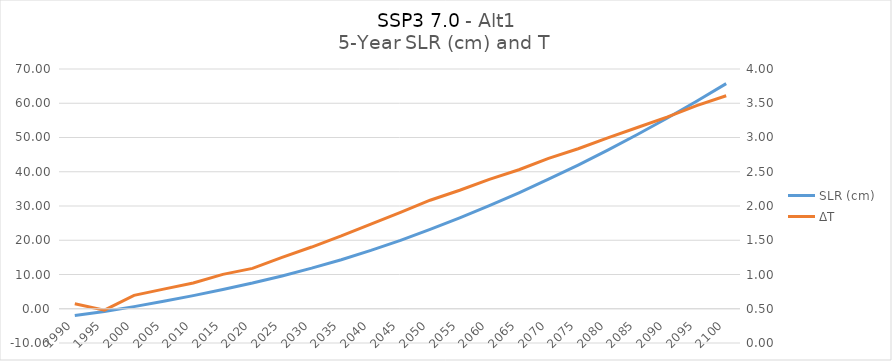
| Category | SLR (cm) |
|---|---|
| 1990.0 | -1.941 |
| 1995.0 | -0.818 |
| 2000.0 | 0.621 |
| 2005.0 | 2.18 |
| 2010.0 | 3.834 |
| 2015.0 | 5.633 |
| 2020.0 | 7.505 |
| 2025.0 | 9.582 |
| 2030.0 | 11.846 |
| 2035.0 | 14.321 |
| 2040.0 | 17.03 |
| 2045.0 | 19.967 |
| 2050.0 | 23.152 |
| 2055.0 | 26.519 |
| 2060.0 | 30.098 |
| 2065.0 | 33.847 |
| 2070.0 | 37.818 |
| 2075.0 | 41.963 |
| 2080.0 | 46.317 |
| 2085.0 | 50.865 |
| 2090.0 | 55.604 |
| 2095.0 | 60.573 |
| 2100.0 | 65.723 |